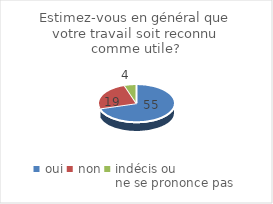
| Category | Estimez-vous en général que votre travail soit reconnu comme utile? |
|---|---|
| oui | 55 |
| non | 19 |
| indécis ou 
ne se prononce pas | 4 |